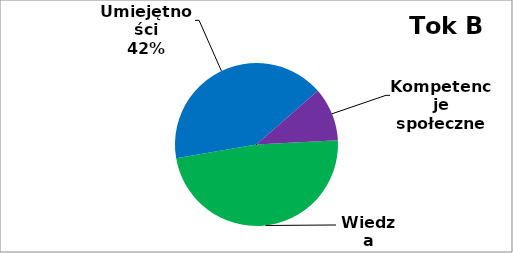
| Category | Series 0 |
|---|---|
| 0 | 154 |
| 1 | 132 |
| 2 | 34 |